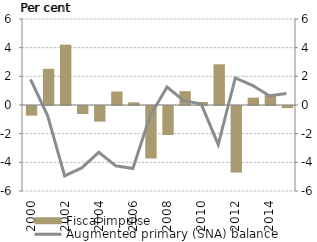
| Category | Fiscal impulse |
|---|---|
| 2000-01-01 | -0.672 |
| 2001-01-01 | 2.524 |
| 2002-01-01 | 4.211 |
| 2003-01-01 | -0.559 |
| 2004-01-01 | -1.087 |
| 2005-01-01 | 0.942 |
| 2006-01-01 | 0.187 |
| 2007-01-01 | -3.662 |
| 2008-01-01 | -2.021 |
| 2009-01-01 | 0.965 |
| 2010-01-01 | 0.209 |
| 2011-01-01 | 2.839 |
| 2012-01-01 | -4.645 |
| 2013-01-01 | 0.512 |
| 2014-01-01 | 0.728 |
| 2015-01-01 | -0.151 |